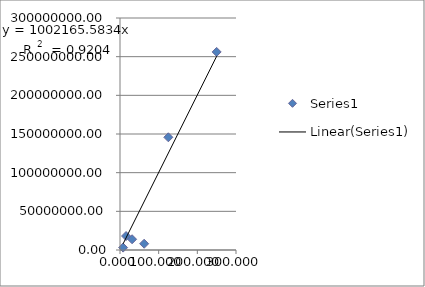
| Category | Series 0 |
|---|---|
| 8.06 | 3107696.096 |
| 15.625 | 18057195.744 |
| 31.25 | 13894875.886 |
| 62.5 | 8100256.428 |
| 125.0 | 145745195.511 |
| 250.0 | 256126097.606 |